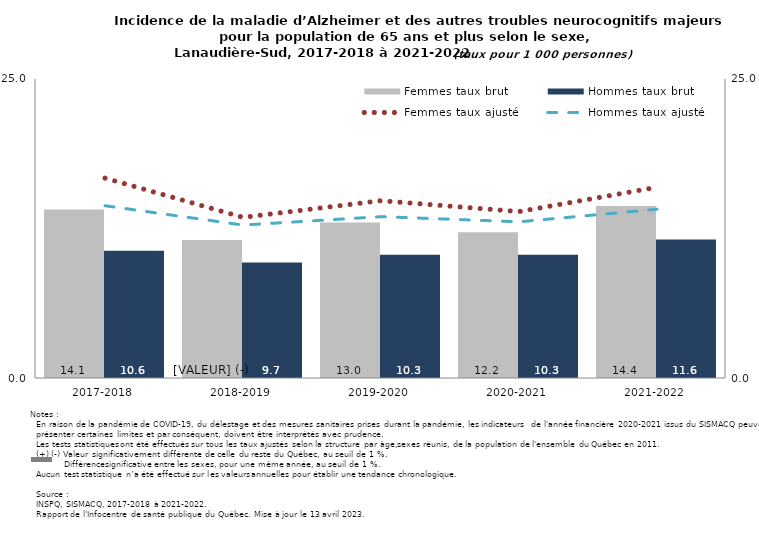
| Category | Femmes taux brut | Hommes taux brut |
|---|---|---|
| 2017-2018 | 14.078 | 10.63 |
| 2018-2019 | 11.538 | 9.657 |
| 2019-2020 | 12.995 | 10.314 |
| 2020-2021 | 12.177 | 10.302 |
| 2021-2022 | 14.387 | 11.572 |